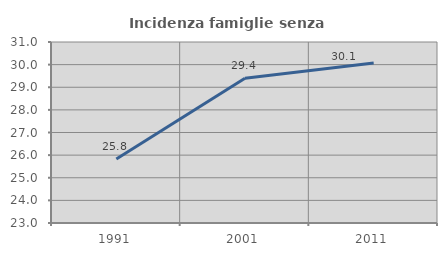
| Category | Incidenza famiglie senza nuclei |
|---|---|
| 1991.0 | 25.832 |
| 2001.0 | 29.397 |
| 2011.0 | 30.067 |